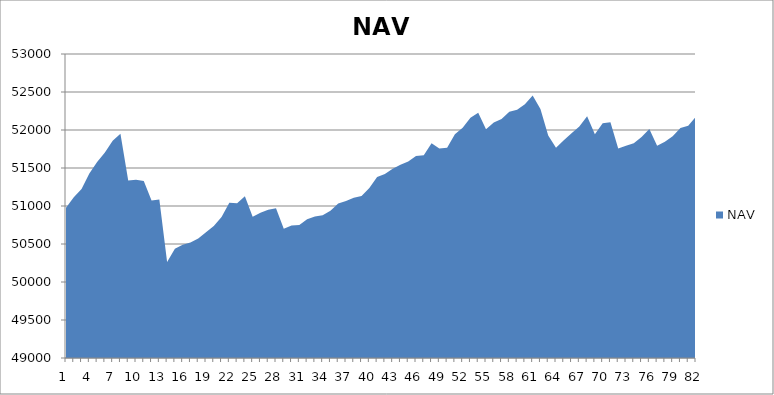
| Category | NAV |
|---|---|
| 0 | 50975.413 |
| 1 | 51115.874 |
| 2 | 51223.542 |
| 3 | 51427.364 |
| 4 | 51580.567 |
| 5 | 51704.692 |
| 6 | 51858.016 |
| 7 | 51951.766 |
| 8 | 51336.067 |
| 9 | 51345.356 |
| 10 | 51328.667 |
| 11 | 51072.985 |
| 12 | 51085.199 |
| 13 | 50261.67 |
| 14 | 50438.394 |
| 15 | 50489.896 |
| 16 | 50518.251 |
| 17 | 50572.468 |
| 18 | 50655.55 |
| 19 | 50737.787 |
| 20 | 50856.035 |
| 21 | 51041.806 |
| 22 | 51034.925 |
| 23 | 51128.589 |
| 24 | 50859.456 |
| 25 | 50911.137 |
| 26 | 50950.007 |
| 27 | 50970.175 |
| 28 | 50701.326 |
| 29 | 50743.495 |
| 30 | 50751.546 |
| 31 | 50826.725 |
| 32 | 50860.533 |
| 33 | 50879.283 |
| 34 | 50936.644 |
| 35 | 51031.381 |
| 36 | 51065.306 |
| 37 | 51109.987 |
| 38 | 51132.251 |
| 39 | 51238.242 |
| 40 | 51380.786 |
| 41 | 51420.042 |
| 42 | 51490.787 |
| 43 | 51541.14 |
| 44 | 51584.924 |
| 45 | 51657.998 |
| 46 | 51667.348 |
| 47 | 51825.763 |
| 48 | 51755.412 |
| 49 | 51767.57 |
| 50 | 51945.15 |
| 51 | 52028.391 |
| 52 | 52160.744 |
| 53 | 52227.009 |
| 54 | 52009.927 |
| 55 | 52099.094 |
| 56 | 52144.26 |
| 57 | 52240.689 |
| 58 | 52266.163 |
| 59 | 52339.405 |
| 60 | 52453.236 |
| 61 | 52275.154 |
| 62 | 51926 |
| 63 | 51766.425 |
| 64 | 51865.11 |
| 65 | 51955.727 |
| 66 | 52045.452 |
| 67 | 52179.744 |
| 68 | 51944.5 |
| 69 | 52088.896 |
| 70 | 52102.813 |
| 71 | 51756.659 |
| 72 | 51793.477 |
| 73 | 51824.02 |
| 74 | 51909.314 |
| 75 | 52012.255 |
| 76 | 51792.924 |
| 77 | 51844.353 |
| 78 | 51918.772 |
| 79 | 52026.272 |
| 80 | 52057.522 |
| 81 | 52176.272 |